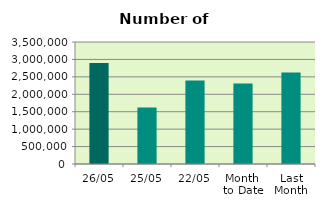
| Category | Series 0 |
|---|---|
| 26/05 | 2896322 |
| 25/05 | 1620230 |
| 22/05 | 2393068 |
| Month 
to Date | 2310526.588 |
| Last
Month | 2628131 |